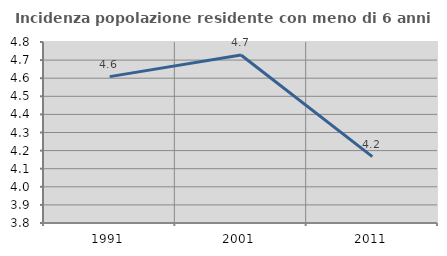
| Category | Incidenza popolazione residente con meno di 6 anni |
|---|---|
| 1991.0 | 4.609 |
| 2001.0 | 4.728 |
| 2011.0 | 4.167 |